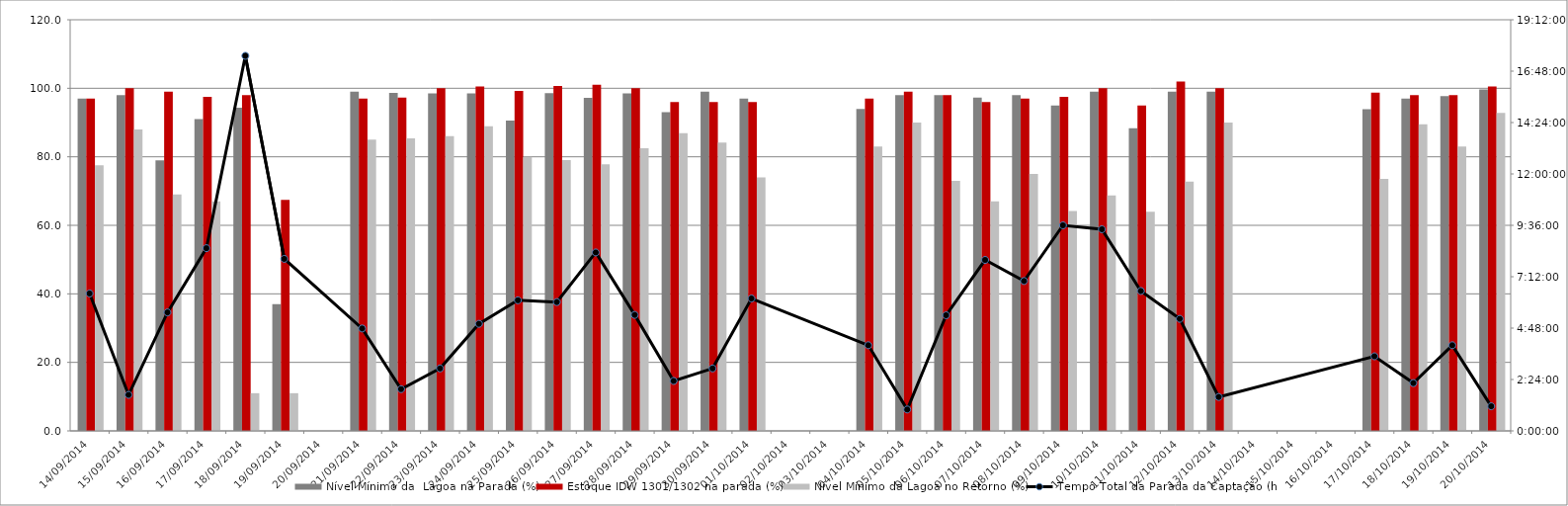
| Category | Nível Mínimo da  Lagoa na Parada (%) | Estoque IDW 1301/1302 na parada (%) | Nível Mínimo da Lagoa no Retorno (%) |
|---|---|---|---|
| 14/09/2014 | 97 | 97 | 77.5 |
| 15/09/2014 | 98 | 100 | 88 |
| 16/09/2014 | 79 | 99 | 69 |
| 17/09/2014 | 91 | 97.5 | 66.97 |
| 18/09/2014 | 94.31 | 98 | 11 |
| 19/09/2014 | 37 | 67.44 | 11 |
| 21/09/2014 | 99 | 97 | 85 |
| 22/09/2014 | 98.64 | 97.3 | 85.36 |
| 23/09/2014 | 98.5 | 100 | 86 |
| 24/09/2014 | 98.5 | 100.5 | 88.9 |
| 25/09/2014 | 90.6 | 99.23 | 80 |
| 26/09/2014 | 98.6 | 100.7 | 79.05 |
| 27/09/2014 | 97.2 | 101 | 77.8 |
| 28/09/2014 | 98.5 | 100 | 82.5 |
| 29/09/2014 | 93 | 96 | 86.9 |
| 30/09/2014 | 99 | 96 | 84.13 |
| 01/10/2014 | 97 | 96 | 74 |
| 04/10/2014 | 94 | 97 | 83 |
| 05/10/2014 | 98 | 99 | 90 |
| 06/10/2014 | 98 | 98 | 73 |
| 07/10/2014 | 97.3 | 96 | 67 |
| 08/10/2014 | 98 | 97 | 75 |
| 09/10/2014 | 95 | 97.53 | 64.15 |
| 10/10/2014 | 99 | 100 | 68.76 |
| 11/10/2014 | 88.32 | 95 | 64 |
| 12/10/2014 | 99 | 102 | 72.73 |
| 13/10/2014 | 99 | 100 | 90 |
| 17/10/2014 | 93.93 | 98.75 | 73.55 |
| 18/10/2014 | 97 | 98 | 89.5 |
| 19/10/2014 | 97.7 | 98 | 83 |
| 20/10/2014 | 99.63 | 100.55 | 92.8 |